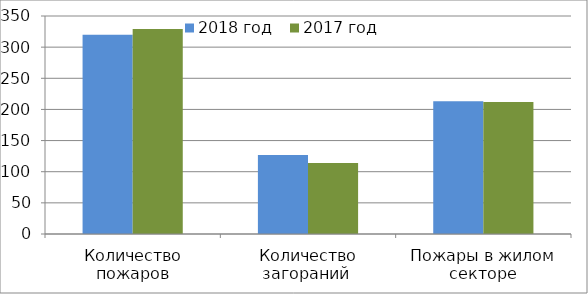
| Category | 2018 год | 2017 год |
|---|---|---|
| Количество пожаров | 320 | 329 |
| Количество загораний  | 127 | 114 |
| Пожары в жилом секторе | 213 | 212 |